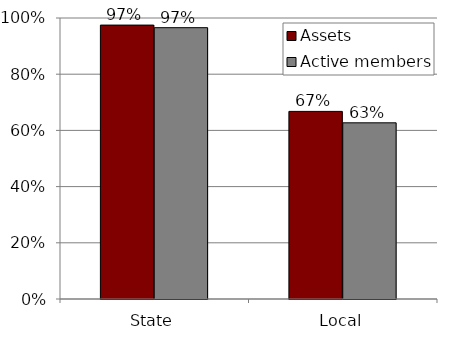
| Category | Assets | Active members |
|---|---|---|
| State | 0.975 | 0.966 |
| Local | 0.668 | 0.627 |